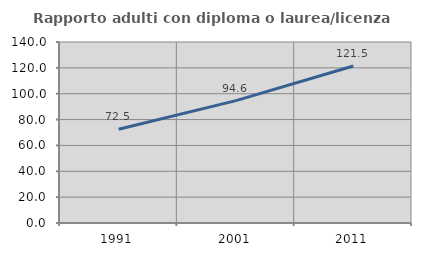
| Category | Rapporto adulti con diploma o laurea/licenza media  |
|---|---|
| 1991.0 | 72.526 |
| 2001.0 | 94.634 |
| 2011.0 | 121.457 |